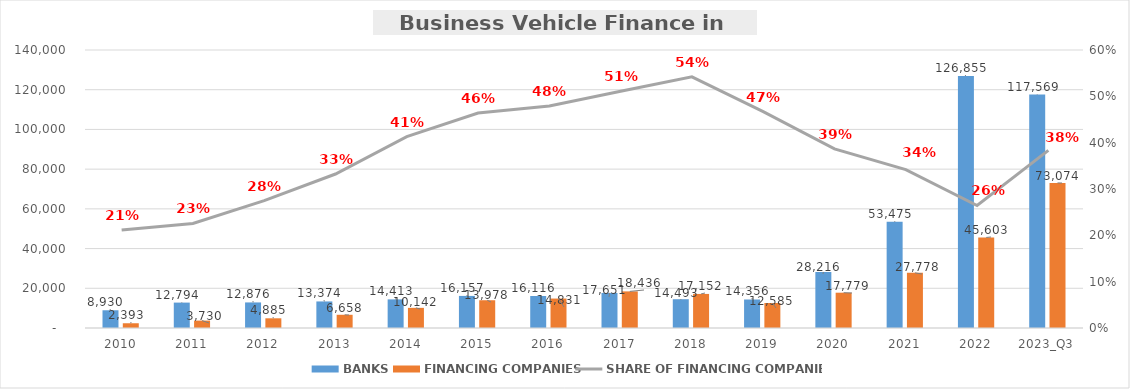
| Category | BANKS | FINANCING COMPANIES |
|---|---|---|
| 2010 | 8930.131 | 2392.721 |
| 2011 | 12793.723 | 3729.987 |
| 2012 | 12876.346 | 4885.495 |
| 2013 | 13374.424 | 6657.806 |
| 2014 | 14412.767 | 10141.887 |
| 2015 | 16157.225 | 13978.426 |
| 2016 | 16116.463 | 14831.249 |
| 2017 | 17650.963 | 18436.034 |
| 2018 | 14492.83 | 17152.034 |
| 2019 | 14355.978 | 12584.792 |
| 2020 | 28216.157 | 17779.072 |
| 2021 | 53475.488 | 27778.353 |
| 2022 | 126855.404 | 45602.871 |
| 2023_Q3 | 117568.564 | 73074.399 |